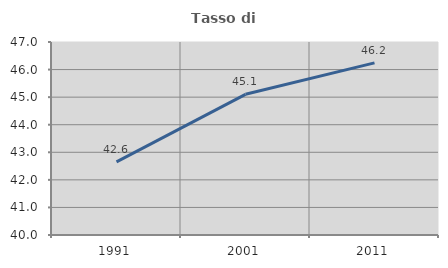
| Category | Tasso di occupazione   |
|---|---|
| 1991.0 | 42.65 |
| 2001.0 | 45.103 |
| 2011.0 | 46.244 |